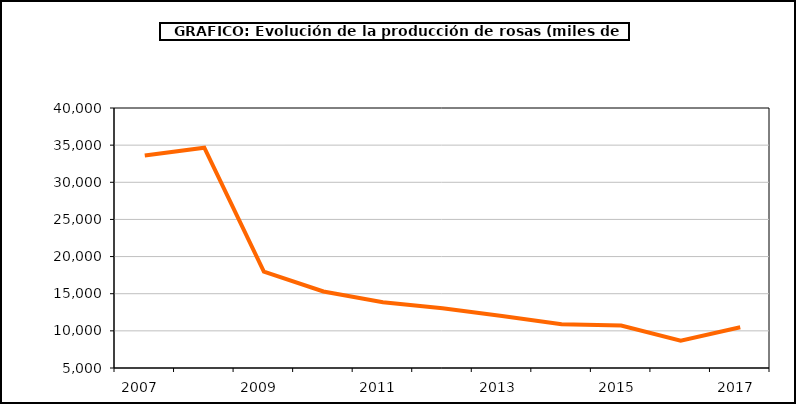
| Category | producción |
|---|---|
| 2007.0 | 33616 |
| 2008.0 | 34657 |
| 2009.0 | 17983 |
| 2010.0 | 15301 |
| 2011.0 | 13840 |
| 2012.0 | 13038 |
| 2013.0 | 11993 |
| 2014.0 | 10897 |
| 2015.0 | 10725 |
| 2016.0 | 8682 |
| 2017.0 | 10480 |